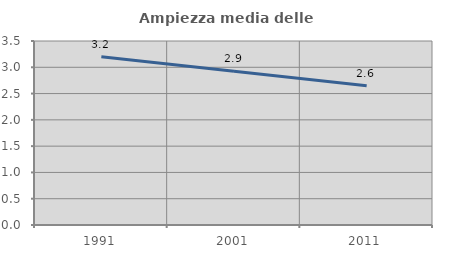
| Category | Ampiezza media delle famiglie |
|---|---|
| 1991.0 | 3.201 |
| 2001.0 | 2.922 |
| 2011.0 | 2.649 |